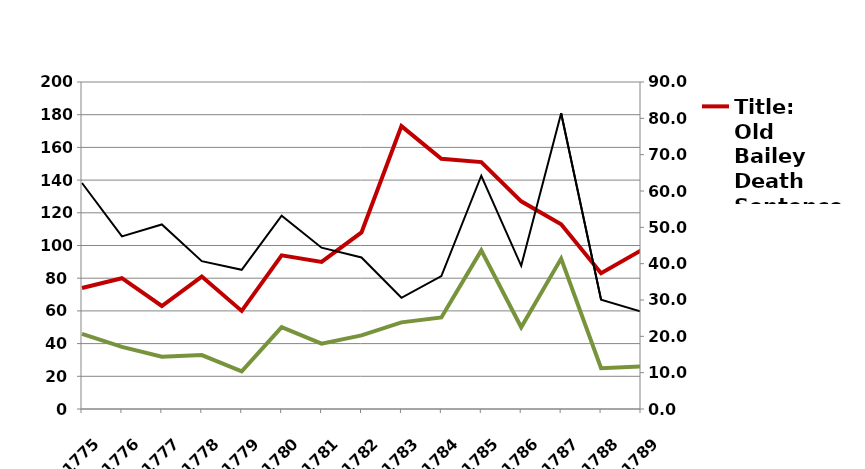
| Category | Title:  Old Bailey Death Sentences and Executions, 1749-1806 |
|---|---|
| 1775 | 46 |
| 1776 | 38 |
| 1777 | 32 |
| 1778 | 33 |
| 1779 | 23 |
| 1780 | 50 |
| 1781 | 40 |
| 1782 | 45 |
| 1783 | 53 |
| 1784 | 56 |
| 1785 | 97 |
| 1786 | 50 |
| 1787 | 92 |
| 1788 | 25 |
| 1789 | 26 |